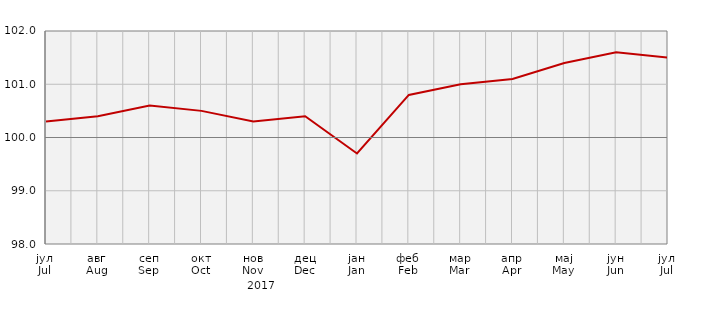
| Category | Индекси потрошачких цијена
Consumer price indices |
|---|---|
| јул
Jul | 100.3 |
| авг
Aug | 100.4 |
| сеп
Sep | 100.6 |
| окт
Oct | 100.5 |
| нов
Nov | 100.3 |
| дец
Dec | 100.4 |
| јан
Jan | 99.7 |
| феб
Feb | 100.8 |
| мар
Mar | 101 |
| апр
Apr | 101.1 |
| мај
May | 101.4 |
| јун
Jun | 101.6 |
| јул
Jul | 101.5 |